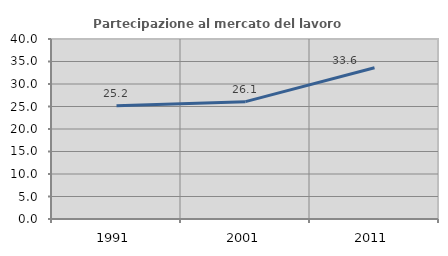
| Category | Partecipazione al mercato del lavoro  femminile |
|---|---|
| 1991.0 | 25.175 |
| 2001.0 | 26.076 |
| 2011.0 | 33.602 |